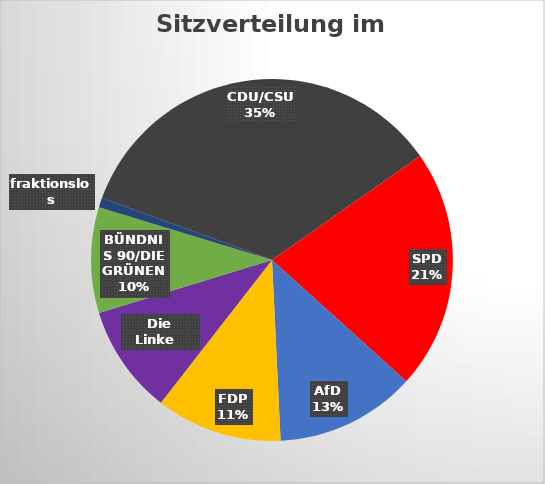
| Category | Series 0 |
|---|---|
| CDU/CSU | 246 |
| SPD | 152 |
| AfD | 89 |
| FDP | 80 |
| Die Linke   | 69 |
| BÜNDNIS 90/DIE GRÜNEN | 67 |
| fraktionslos | 6 |